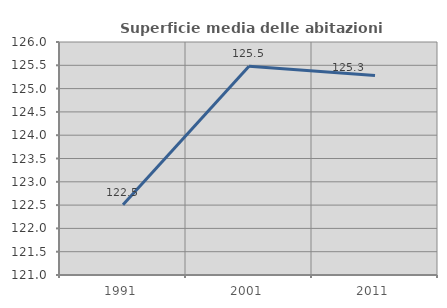
| Category | Superficie media delle abitazioni occupate |
|---|---|
| 1991.0 | 122.509 |
| 2001.0 | 125.481 |
| 2011.0 | 125.284 |